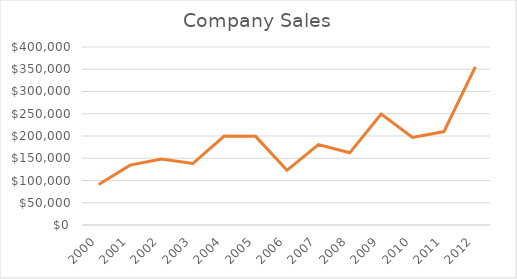
| Category | Sales |
|---|---|
| 2000.0 | 91163 |
| 2001.0 | 134599 |
| 2002.0 | 148414 |
| 2003.0 | 138115 |
| 2004.0 | 199845 |
| 2005.0 | 199185 |
| 2006.0 | 122919 |
| 2007.0 | 180820 |
| 2008.0 | 162194 |
| 2009.0 | 249388 |
| 2010.0 | 196892 |
| 2011.0 | 209926 |
| 2012.0 | 355488 |